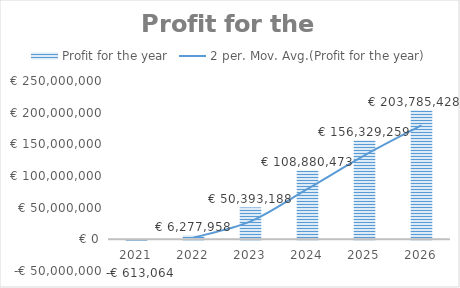
| Category | Profit for the year |
|---|---|
| 2021.0 | -613063.639 |
| 2022.0 | 6277957.693 |
| 2023.0 | 50393188.195 |
| 2024.0 | 108880472.625 |
| 2025.0 | 156329258.76 |
| 2026.0 | 203785427.768 |